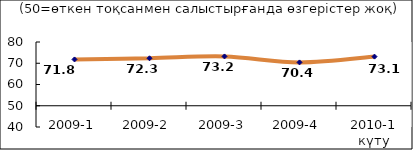
| Category | Диф.индекс ↓ |
|---|---|
| 2009-1 | 71.79 |
| 2009-2 | 72.345 |
| 2009-3 | 73.205 |
| 2009-4 | 70.39 |
| 2010-1 күту | 73.125 |